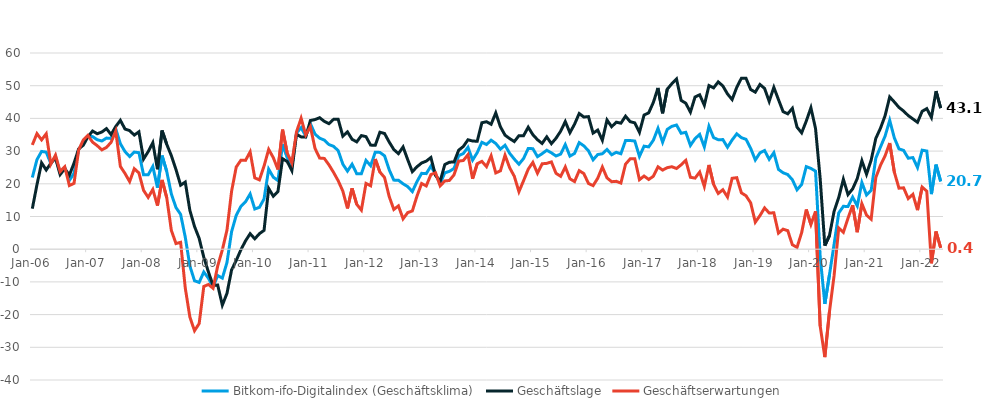
| Category | Bitkom-ifo-Digitalindex (Geschäftsklima) | Geschäftslage | Geschäftserwartungen |
|---|---|---|---|
| 2006-01-01 | 21.926 | 12.395 | 31.885 |
| 2006-02-01 | 27.392 | 19.708 | 35.344 |
| 2006-03-01 | 29.9 | 26.42 | 33.432 |
| 2006-04-01 | 29.695 | 24.222 | 35.302 |
| 2006-05-01 | 26.17 | 26.301 | 26.038 |
| 2006-06-01 | 28.326 | 27.892 | 28.761 |
| 2006-07-01 | 23.276 | 22.812 | 23.741 |
| 2006-08-01 | 24.925 | 24.63 | 25.221 |
| 2006-09-01 | 21.065 | 22.676 | 19.465 |
| 2006-10-01 | 23.216 | 26.324 | 20.151 |
| 2006-11-01 | 30.503 | 30.662 | 30.345 |
| 2006-12-01 | 32.614 | 31.811 | 33.42 |
| 2007-01-01 | 34.592 | 34.384 | 34.801 |
| 2007-02-01 | 34.427 | 36.139 | 32.728 |
| 2007-03-01 | 33.481 | 35.311 | 31.665 |
| 2007-04-01 | 33.091 | 35.836 | 30.378 |
| 2007-05-01 | 33.982 | 36.874 | 31.125 |
| 2007-06-01 | 33.874 | 35.053 | 32.7 |
| 2007-07-01 | 36.814 | 37.518 | 36.113 |
| 2007-08-01 | 32.258 | 39.411 | 25.318 |
| 2007-09-01 | 29.853 | 36.75 | 23.156 |
| 2007-10-01 | 28.341 | 36.265 | 20.683 |
| 2007-11-01 | 29.701 | 34.895 | 24.622 |
| 2007-12-01 | 29.526 | 35.903 | 23.321 |
| 2008-01-01 | 22.738 | 27.562 | 18.016 |
| 2008-02-01 | 22.732 | 29.833 | 15.85 |
| 2008-03-01 | 25.306 | 32.569 | 18.27 |
| 2008-04-01 | 18.828 | 24.458 | 13.339 |
| 2008-05-01 | 28.612 | 36.285 | 21.188 |
| 2008-06-01 | 23.798 | 32.103 | 15.791 |
| 2008-07-01 | 16.872 | 28.594 | 5.751 |
| 2008-08-01 | 12.738 | 24.347 | 1.728 |
| 2008-09-01 | 10.658 | 19.58 | 2.099 |
| 2008-10-01 | 3.702 | 20.526 | -11.839 |
| 2008-11-01 | -5.143 | 11.854 | -20.777 |
| 2008-12-01 | -9.655 | 6.95 | -24.928 |
| 2009-01-01 | -10.159 | 3.32 | -22.745 |
| 2009-02-01 | -6.976 | -2.46 | -11.389 |
| 2009-03-01 | -8.886 | -6.967 | -10.786 |
| 2009-04-01 | -11.511 | -11.074 | -11.947 |
| 2009-05-01 | -8.065 | -10.96 | -5.125 |
| 2009-06-01 | -8.847 | -17.105 | -0.217 |
| 2009-07-01 | -4.081 | -13.516 | 5.832 |
| 2009-08-01 | 5.364 | -6.314 | 17.745 |
| 2009-09-01 | 10.365 | -3.438 | 25.137 |
| 2009-10-01 | 13.059 | -0.196 | 27.194 |
| 2009-11-01 | 14.498 | 2.537 | 27.165 |
| 2009-12-01 | 16.89 | 4.741 | 29.76 |
| 2010-01-01 | 12.294 | 3.179 | 21.818 |
| 2010-02-01 | 12.806 | 4.741 | 21.188 |
| 2010-03-01 | 15.361 | 5.765 | 25.403 |
| 2010-04-01 | 24.475 | 18.579 | 30.53 |
| 2010-05-01 | 22.012 | 16.191 | 27.99 |
| 2010-06-01 | 20.986 | 17.646 | 24.377 |
| 2010-07-01 | 32.068 | 27.671 | 36.55 |
| 2010-08-01 | 28.12 | 26.827 | 29.421 |
| 2010-09-01 | 25.193 | 24.039 | 26.353 |
| 2010-10-01 | 35.512 | 35.17 | 35.856 |
| 2010-11-01 | 37.174 | 34.334 | 40.048 |
| 2010-12-01 | 34.621 | 34.317 | 34.926 |
| 2011-01-01 | 38.409 | 39.353 | 37.47 |
| 2011-02-01 | 35.187 | 39.643 | 30.814 |
| 2011-03-01 | 33.956 | 40.21 | 27.864 |
| 2011-04-01 | 33.361 | 39.099 | 27.76 |
| 2011-05-01 | 32.007 | 38.382 | 25.803 |
| 2011-06-01 | 31.457 | 39.712 | 23.487 |
| 2011-07-01 | 30.132 | 39.716 | 20.931 |
| 2011-08-01 | 26.014 | 34.569 | 17.771 |
| 2011-09-01 | 23.868 | 35.878 | 12.468 |
| 2011-10-01 | 25.983 | 33.602 | 18.612 |
| 2011-11-01 | 23.071 | 32.821 | 13.729 |
| 2011-12-01 | 23.061 | 34.742 | 11.96 |
| 2012-01-01 | 27.149 | 34.422 | 20.101 |
| 2012-02-01 | 25.53 | 31.833 | 19.399 |
| 2012-03-01 | 29.673 | 31.789 | 27.577 |
| 2012-04-01 | 29.598 | 35.772 | 23.585 |
| 2012-05-01 | 28.56 | 35.384 | 21.934 |
| 2012-06-01 | 24.297 | 32.782 | 16.121 |
| 2012-07-01 | 21.127 | 30.482 | 12.152 |
| 2012-08-01 | 21.092 | 29.223 | 13.249 |
| 2012-09-01 | 20.001 | 31.267 | 9.285 |
| 2012-10-01 | 19.14 | 27.386 | 11.194 |
| 2012-11-01 | 17.619 | 23.7 | 11.703 |
| 2012-12-01 | 20.68 | 25.214 | 16.236 |
| 2013-01-01 | 23.199 | 26.362 | 20.08 |
| 2013-02-01 | 23.112 | 26.929 | 19.36 |
| 2013-03-01 | 25.407 | 28.034 | 22.811 |
| 2013-04-01 | 22.969 | 22.562 | 23.376 |
| 2013-05-01 | 20.055 | 20.752 | 19.36 |
| 2013-06-01 | 23.353 | 25.871 | 20.862 |
| 2013-07-01 | 23.802 | 26.611 | 21.028 |
| 2013-08-01 | 24.702 | 26.664 | 22.757 |
| 2013-09-01 | 28.609 | 30.283 | 26.947 |
| 2013-10-01 | 29.256 | 31.414 | 27.118 |
| 2013-11-01 | 31.169 | 33.457 | 28.903 |
| 2013-12-01 | 27.243 | 33.089 | 21.543 |
| 2014-01-01 | 29.545 | 33.008 | 26.134 |
| 2014-02-01 | 32.691 | 38.669 | 26.862 |
| 2014-03-01 | 32.017 | 38.984 | 25.254 |
| 2014-04-01 | 33.335 | 38.209 | 28.56 |
| 2014-05-01 | 32.329 | 41.688 | 23.332 |
| 2014-06-01 | 30.601 | 37.432 | 23.967 |
| 2014-07-01 | 31.791 | 34.877 | 28.746 |
| 2014-08-01 | 29.317 | 33.825 | 24.896 |
| 2014-09-01 | 27.547 | 32.92 | 22.299 |
| 2014-10-01 | 25.988 | 34.718 | 17.583 |
| 2014-11-01 | 27.735 | 34.721 | 20.957 |
| 2014-12-01 | 30.791 | 37.308 | 24.452 |
| 2015-01-01 | 30.744 | 35.024 | 26.543 |
| 2015-02-01 | 28.296 | 33.483 | 23.224 |
| 2015-03-01 | 29.208 | 32.337 | 26.122 |
| 2015-04-01 | 30.264 | 34.354 | 26.244 |
| 2015-05-01 | 29.472 | 32.277 | 26.701 |
| 2015-06-01 | 28.51 | 33.932 | 23.214 |
| 2015-07-01 | 29.084 | 36.087 | 22.287 |
| 2015-08-01 | 31.99 | 39.028 | 25.16 |
| 2015-09-01 | 28.471 | 35.623 | 21.536 |
| 2015-10-01 | 29.288 | 38.228 | 20.685 |
| 2015-11-01 | 32.591 | 41.484 | 24.026 |
| 2015-12-01 | 31.609 | 40.421 | 23.119 |
| 2016-01-01 | 30.1 | 40.547 | 20.106 |
| 2016-02-01 | 27.329 | 35.506 | 19.437 |
| 2016-03-01 | 28.946 | 36.43 | 21.699 |
| 2016-04-01 | 29.188 | 33.313 | 25.136 |
| 2016-05-01 | 30.496 | 39.515 | 21.816 |
| 2016-06-01 | 28.894 | 37.453 | 20.643 |
| 2016-07-01 | 29.625 | 38.851 | 20.754 |
| 2016-08-01 | 29.197 | 38.533 | 20.227 |
| 2016-09-01 | 33.226 | 40.678 | 26.005 |
| 2016-10-01 | 33.242 | 38.997 | 27.626 |
| 2016-11-01 | 33.071 | 38.634 | 27.637 |
| 2016-12-01 | 28.376 | 35.73 | 21.25 |
| 2017-01-01 | 31.509 | 41.019 | 22.374 |
| 2017-02-01 | 31.294 | 41.71 | 21.326 |
| 2017-03-01 | 33.322 | 44.885 | 22.304 |
| 2017-04-01 | 36.943 | 49.304 | 25.194 |
| 2017-05-01 | 32.71 | 41.558 | 24.186 |
| 2017-06-01 | 36.638 | 48.938 | 24.945 |
| 2017-07-01 | 37.576 | 50.617 | 25.213 |
| 2017-08-01 | 37.971 | 52.051 | 24.678 |
| 2017-09-01 | 35.448 | 45.507 | 25.801 |
| 2017-10-01 | 35.744 | 44.638 | 27.172 |
| 2017-11-01 | 31.741 | 41.918 | 21.992 |
| 2017-12-01 | 33.814 | 46.552 | 21.735 |
| 2018-01-01 | 35.106 | 47.22 | 23.584 |
| 2018-02-01 | 31.278 | 44.024 | 19.198 |
| 2018-03-01 | 37.593 | 50.036 | 25.768 |
| 2018-04-01 | 34.118 | 49.332 | 19.833 |
| 2018-05-01 | 33.485 | 51.17 | 17.046 |
| 2018-06-01 | 33.515 | 49.919 | 18.187 |
| 2018-07-01 | 31.185 | 47.479 | 15.964 |
| 2018-08-01 | 33.412 | 45.761 | 21.684 |
| 2018-09-01 | 35.285 | 49.509 | 21.872 |
| 2018-10-01 | 34.104 | 52.283 | 17.235 |
| 2018-11-01 | 33.602 | 52.247 | 16.335 |
| 2018-12-01 | 30.853 | 48.832 | 14.173 |
| 2019-01-01 | 27.278 | 48.023 | 8.269 |
| 2019-02-01 | 29.45 | 50.384 | 10.266 |
| 2019-03-01 | 30.176 | 49.168 | 12.632 |
| 2019-04-01 | 27.496 | 45.198 | 11.072 |
| 2019-05-01 | 29.517 | 49.504 | 11.13 |
| 2019-06-01 | 24.404 | 45.744 | 4.917 |
| 2019-07-01 | 23.375 | 42.058 | 6.135 |
| 2019-08-01 | 22.822 | 41.405 | 5.669 |
| 2019-09-01 | 21.24 | 43.086 | 1.358 |
| 2019-10-01 | 18.171 | 37.338 | 0.553 |
| 2019-11-01 | 19.795 | 35.584 | 5.064 |
| 2019-12-01 | 25.259 | 39.19 | 12.139 |
| 2020-01-01 | 24.701 | 43.259 | 7.56 |
| 2020-02-01 | 23.867 | 36.875 | 11.573 |
| 2020-03-01 | -2.251 | 21.567 | -23.508 |
| 2020-04-01 | -16.744 | 1.094 | -33.001 |
| 2020-05-01 | -7.844 | 4.149 | -19.132 |
| 2020-06-01 | 1.499 | 11.581 | -8.103 |
| 2020-07-01 | 11.08 | 15.787 | 6.475 |
| 2020-08-01 | 13.113 | 21.396 | 5.14 |
| 2020-09-01 | 13.052 | 16.706 | 9.46 |
| 2020-10-01 | 15.932 | 18.437 | 13.457 |
| 2020-11-01 | 13.248 | 21.606 | 5.206 |
| 2020-12-01 | 20.37 | 27.05 | 13.886 |
| 2021-01-01 | 16.593 | 22.908 | 10.457 |
| 2021-02-01 | 18.022 | 27.261 | 9.158 |
| 2021-03-01 | 27.824 | 33.881 | 21.924 |
| 2021-04-01 | 31.229 | 36.969 | 25.627 |
| 2021-05-01 | 34.566 | 40.804 | 28.49 |
| 2021-06-01 | 39.409 | 46.561 | 32.465 |
| 2021-07-01 | 34.041 | 45.014 | 23.559 |
| 2021-08-01 | 30.681 | 43.356 | 18.666 |
| 2021-09-01 | 30.213 | 42.255 | 18.77 |
| 2021-10-01 | 27.821 | 40.857 | 15.49 |
| 2021-11-01 | 28.018 | 39.835 | 16.784 |
| 2021-12-01 | 24.976 | 38.809 | 11.944 |
| 2022-01-01 | 30.287 | 42.169 | 18.987 |
| 2022-02-01 | 30.021 | 42.981 | 17.751 |
| 2022-03-01 | 16.841 | 40.289 | -4.319 |
| 2022-04-01 | 25.857 | 48.352 | 5.399 |
| 2022-05-01 | 20.74 | 43.136 | 0.406 |